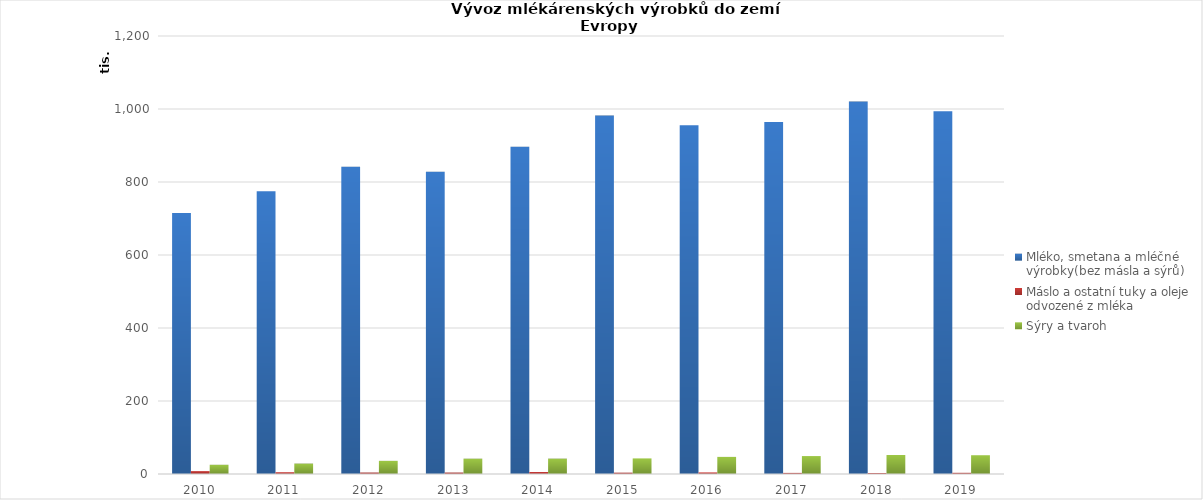
| Category | Mléko, smetana a mléčné výrobky(bez másla a sýrů)  | Máslo a ostatní tuky a oleje odvozené z mléka | Sýry a tvaroh |
|---|---|---|---|
| 2010 | 714787782 | 7888574 | 25257686 |
| 2011 | 774854405 | 4887976 | 28526339 |
| 2012 | 841592777 | 4037368 | 36009749 |
| 2013 | 828184153 | 3986044 | 41969840 |
| 2014 | 896291043 | 5468276 | 42101447 |
| 2015 | 982145790 | 3667284 | 42736282 |
| 2016 | 955321040 | 4359938 | 46842386 |
| 2017 | 964176191 | 3025940 | 49128375 |
| 2018 | 1020460977 | 2741402 | 52073572 |
| 2019 | 993892441 | 3264420 | 51434482 |